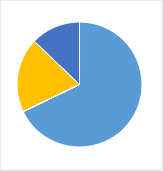
| Category | Series 0 |
|---|---|
| 0 | 0.688 |
| 1 | 0 |
| 2 | 0 |
| 3 | 0.196 |
| 4 | 0.13 |